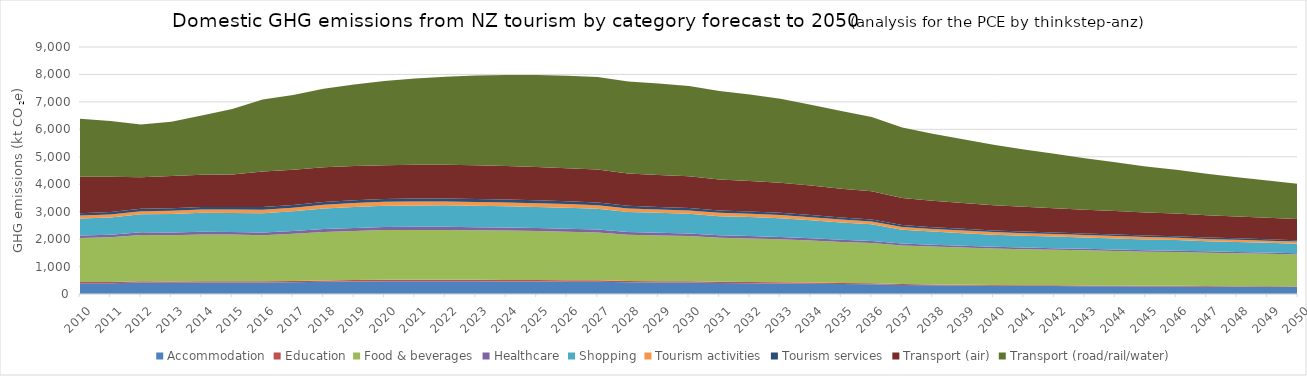
| Category | Accommodation | Education | Food & beverages | Healthcare | Shopping | Tourism activities | Tourism services | Transport (air) | Transport (road/rail/water) |
|---|---|---|---|---|---|---|---|---|---|
| 2010.0 | 391.498 | 43.89 | 1603.812 | 91.784 | 623.725 | 103.693 | 83.088 | 1331.723 | 2109.366 |
| 2011.0 | 395.865 | 44.298 | 1629.091 | 93.535 | 628.271 | 109.324 | 85.726 | 1284.792 | 2028.987 |
| 2012.0 | 415.193 | 47.17 | 1688.05 | 99.102 | 654.679 | 112.843 | 89.173 | 1147.441 | 1926.354 |
| 2013.0 | 412.615 | 45.725 | 1685.684 | 97.687 | 672.978 | 120.214 | 89.52 | 1178.887 | 1970.813 |
| 2014.0 | 418.96 | 45.585 | 1704.113 | 98.432 | 695.506 | 115.065 | 88.414 | 1179.231 | 2159.186 |
| 2015.0 | 417.825 | 45.853 | 1700.402 | 99.396 | 687.024 | 127.016 | 91.708 | 1187.043 | 2382.688 |
| 2016.0 | 415.998 | 45.99 | 1676.425 | 99.35 | 706.062 | 129.732 | 93.533 | 1300.617 | 2623.071 |
| 2017.0 | 427.591 | 48.442 | 1715.55 | 102.748 | 717.626 | 133.685 | 97.412 | 1280.977 | 2728.657 |
| 2018.0 | 444.584 | 51.488 | 1762.51 | 107.226 | 750.81 | 137.873 | 101.831 | 1265.596 | 2856.156 |
| 2019.0 | 453.245 | 53.017 | 1790.547 | 109.142 | 765.343 | 140.028 | 104.066 | 1251.151 | 2963.048 |
| 2020.0 | 461.005 | 54.662 | 1812.465 | 111.111 | 777.498 | 141.851 | 106.081 | 1229.638 | 3065.007 |
| 2021.0 | 463.041 | 55.192 | 1817.386 | 111.635 | 781.201 | 142.164 | 106.389 | 1232.292 | 3141.198 |
| 2022.0 | 463.279 | 55.4 | 1816.859 | 111.643 | 782.181 | 141.931 | 106.169 | 1232.107 | 3209.794 |
| 2023.0 | 460.85 | 55.049 | 1809.236 | 110.798 | 779.558 | 140.898 | 105.145 | 1228.305 | 3267.885 |
| 2024.0 | 457.726 | 54.604 | 1798.938 | 109.793 | 775.602 | 139.612 | 103.905 | 1222.989 | 3315.498 |
| 2025.0 | 453.569 | 54.005 | 1785.008 | 108.53 | 769.977 | 138.013 | 102.382 | 1215.932 | 3352.925 |
| 2026.0 | 449.048 | 53.555 | 1766.513 | 106.754 | 763.781 | 136.069 | 101.085 | 1207.881 | 3370.279 |
| 2027.0 | 443.548 | 52.932 | 1744.921 | 104.762 | 755.933 | 133.834 | 99.476 | 1197.965 | 3374.819 |
| 2028.0 | 423.86 | 48.975 | 1688.75 | 98.1 | 731.876 | 127.894 | 93.651 | 1175.711 | 3352.462 |
| 2029.0 | 419.191 | 48.584 | 1668.18 | 96.555 | 723.853 | 125.754 | 92.172 | 1164.264 | 3330.16 |
| 2030.0 | 415.1 | 48.382 | 1647.798 | 95.249 | 716.272 | 123.949 | 91.186 | 1151.957 | 3288.966 |
| 2031.0 | 399.2 | 44.805 | 1606.607 | 89.578 | 697.115 | 119.228 | 86.265 | 1128.603 | 3226.532 |
| 2032.0 | 393.728 | 43.799 | 1588.747 | 87.529 | 689.523 | 117.127 | 84.457 | 1113.388 | 3154.105 |
| 2033.0 | 386.826 | 42.578 | 1566.577 | 85.106 | 678.766 | 114.611 | 82.241 | 1095.695 | 3061.484 |
| 2034.0 | 375.39 | 40.758 | 1533.601 | 81.648 | 654.963 | 111.363 | 79.156 | 1072.932 | 2948.174 |
| 2035.0 | 362.785 | 38.725 | 1496.822 | 77.919 | 629.529 | 107.801 | 75.741 | 1048.774 | 2826.854 |
| 2036.0 | 352.394 | 36.899 | 1468.932 | 74.514 | 608.138 | 104.916 | 72.943 | 1025.746 | 2707.749 |
| 2037.0 | 327.296 | 32.714 | 1411.074 | 67.902 | 504.883 | 99.652 | 67.365 | 985.191 | 2566.651 |
| 2038.0 | 317.013 | 31.235 | 1382.205 | 64.895 | 478.645 | 97.246 | 65.23 | 961.008 | 2443.125 |
| 2039.0 | 308.603 | 29.966 | 1355.032 | 62.352 | 461.808 | 94.936 | 63.332 | 939.503 | 2319.684 |
| 2040.0 | 300.642 | 28.856 | 1328.179 | 60.013 | 445.056 | 92.718 | 61.585 | 918.455 | 2198.635 |
| 2041.0 | 295.124 | 28.044 | 1311.098 | 58.139 | 431.812 | 91.203 | 60.432 | 899.72 | 2087.633 |
| 2042.0 | 290.861 | 27.433 | 1294.746 | 56.623 | 424.202 | 89.773 | 59.484 | 883.161 | 1980.23 |
| 2043.0 | 286.059 | 26.782 | 1277.32 | 55.045 | 415.263 | 88.229 | 58.425 | 866.63 | 1876.45 |
| 2044.0 | 281.118 | 26.112 | 1259.452 | 53.455 | 405.789 | 86.597 | 57.295 | 850.589 | 1776.432 |
| 2045.0 | 276.027 | 25.47 | 1240.584 | 51.904 | 396.044 | 84.937 | 56.159 | 835.289 | 1680.843 |
| 2046.0 | 272.973 | 25.018 | 1230.485 | 50.651 | 389.246 | 83.847 | 55.471 | 822.227 | 1595.255 |
| 2047.0 | 266.364 | 24.129 | 1214.03 | 48.694 | 369.248 | 82.323 | 54.174 | 806.38 | 1512.149 |
| 2048.0 | 262.353 | 23.561 | 1199.709 | 47.323 | 361.279 | 80.972 | 53.247 | 794.214 | 1433.338 |
| 2049.0 | 258.058 | 22.987 | 1183.873 | 45.954 | 352.987 | 79.559 | 52.273 | 782.59 | 1357.878 |
| 2050.0 | 253.34 | 22.367 | 1166.266 | 44.54 | 344.253 | 78.055 | 51.208 | 771.339 | 1285.724 |